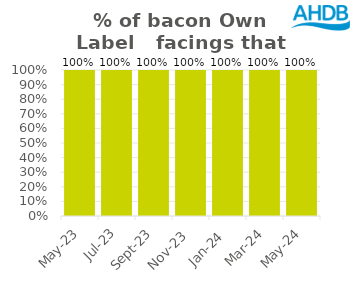
| Category | Bacon |
|---|---|
| 2023-05-01 | 1 |
| 2023-07-01 | 1 |
| 2023-09-01 | 1 |
| 2023-11-01 | 1 |
| 2024-01-01 | 1 |
| 2024-03-01 | 1 |
| 2024-05-01 | 1 |